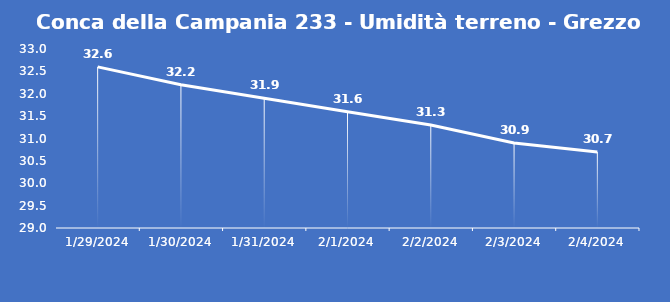
| Category | Conca della Campania 233 - Umidità terreno - Grezzo (%VWC) |
|---|---|
| 1/29/24 | 32.6 |
| 1/30/24 | 32.2 |
| 1/31/24 | 31.9 |
| 2/1/24 | 31.6 |
| 2/2/24 | 31.3 |
| 2/3/24 | 30.9 |
| 2/4/24 | 30.7 |